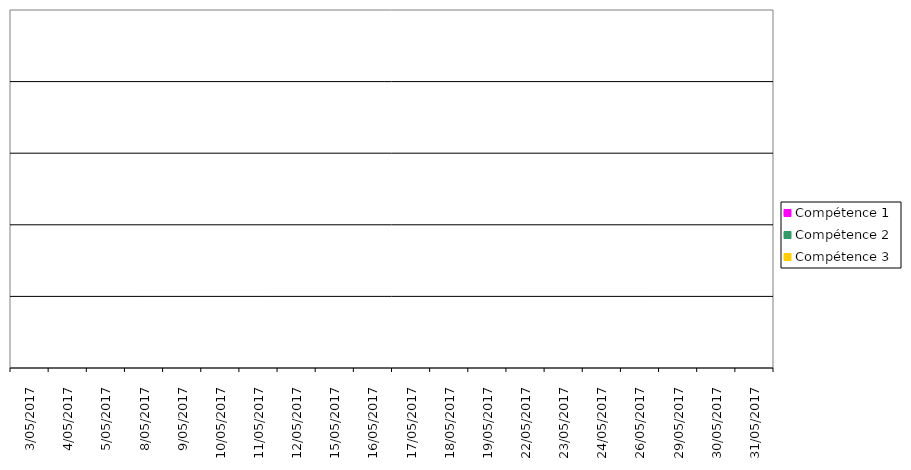
| Category | Compétence 1 | Compétence 2 | Compétence 3 |
|---|---|---|---|
| 3/05/2017 | 0 | 0 | 0 |
| 4/05/2017 | 0 | 0 | 0 |
| 5/05/2017 | 0 | 0 | 0 |
| 8/05/2017 | 0 | 0 | 0 |
| 9/05/2017 | 0 | 0 | 0 |
| 10/05/2017 | 0 | 0 | 0 |
| 11/05/2017 | 0 | 0 | 0 |
| 12/05/2017 | 0 | 0 | 0 |
| 15/05/2017 | 0 | 0 | 0 |
| 16/05/2017 | 0 | 0 | 0 |
| 17/05/2017 | 0 | 0 | 0 |
| 18/05/2017 | 0 | 0 | 0 |
| 19/05/2017 | 0 | 0 | 0 |
| 22/05/2017 | 0 | 0 | 0 |
| 23/05/2017 | 0 | 0 | 0 |
| 24/05/2017 | 0 | 0 | 0 |
| 26/05/2017 | 0 | 0 | 0 |
| 29/05/2017 | 0 | 0 | 0 |
| 30/05/2017 | 0 | 0 | 0 |
| 31/05/2017 | 0 | 0 | 0 |